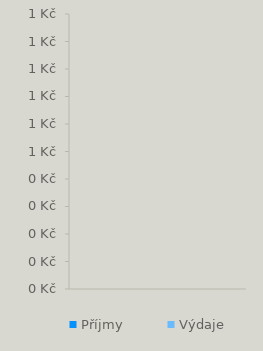
| Category | Příjmy | Výdaje |
|---|---|---|
| 0 | 0 | 0 |